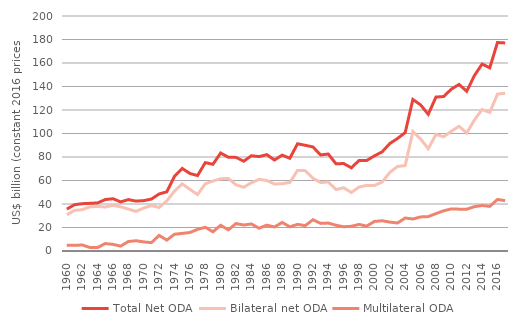
| Category | Total Net ODA | Bilateral net ODA | Multilateral ODA |
|---|---|---|---|
| 1960 | 35673.917 | 30791.372 | 4882.545 |
| 1961 | 39410.357 | 34618.006 | 4792.35 |
| 1962 | 40267.227 | 35146.929 | 5120.299 |
| 1963 | 40559.885 | 37550.515 | 3009.37 |
| 1964 | 40926.727 | 37965.61 | 2961.117 |
| 1965 | 43778.007 | 37449.271 | 6328.736 |
| 1966 | 44488.398 | 38849.524 | 5638.875 |
| 1967 | 41783.893 | 37628.273 | 4155.678 |
| 1968 | 43755.819 | 35680.089 | 8075.73 |
| 1969 | 42462.441 | 33740.754 | 8721.688 |
| 1970 | 42866.288 | 36571.936 | 7740.032 |
| 1971 | 44188.388 | 38621.987 | 7109.796 |
| 1972 | 48541.792 | 37047.775 | 13257.013 |
| 1973 | 50357.67 | 42672.479 | 9279.868 |
| 1974 | 63535.672 | 50991.825 | 14261.123 |
| 1975 | 70265.489 | 57117.757 | 14983.631 |
| 1976 | 65976.433 | 52459.68 | 15714.722 |
| 1977 | 64193.42 | 48081.423 | 18401.453 |
| 1978 | 75209.259 | 57138.432 | 20200.453 |
| 1979 | 73821.195 | 59572.068 | 16357.921 |
| 1980 | 83379.323 | 61488.033 | 21891.29 |
| 1981 | 79805.767 | 61796.802 | 18008.964 |
| 1982 | 79665.645 | 56327.777 | 23337.869 |
| 1983 | 76398.92 | 54267.648 | 22131.272 |
| 1984 | 81082.595 | 58083.064 | 22999.531 |
| 1985 | 80339.794 | 60969.911 | 19369.921 |
| 1986 | 82013.503 | 60022.734 | 21990.768 |
| 1987 | 77434.56 | 57001.652 | 20432.949 |
| 1988 | 81580.752 | 57276.179 | 24304.645 |
| 1989 | 78916.05 | 58329.948 | 20586.274 |
| 1990 | 91256.201 | 68594.554 | 22661.785 |
| 1991 | 89966.852 | 68395.816 | 21571.036 |
| 1992 | 88562.815 | 61945.616 | 26617.244 |
| 1993 | 81755.52 | 58246.897 | 23508.603 |
| 1994 | 82537.375 | 58760.197 | 23777.166 |
| 1995 | 74222.679 | 52301.912 | 21920.834 |
| 1996 | 74435.778 | 53807.392 | 20628.374 |
| 1997 | 70794.958 | 49763.025 | 21031.96 |
| 1998 | 77047.8 | 54422.57 | 22625.23 |
| 1999 | 77025.408 | 55840.531 | 21184.873 |
| 2000 | 80961.425 | 55779.906 | 25181.537 |
| 2001 | 84382.195 | 58669.262 | 25711.625 |
| 2002 | 91458.63 | 66846.139 | 24612.462 |
| 2003 | 95773.475 | 71939.592 | 23833.888 |
| 2004 | 100769.253 | 72709.366 | 28059.918 |
| 2005 | 128976.034 | 101731.237 | 27244.796 |
| 2006 | 124384.715 | 95380.433 | 29004.27 |
| 2007 | 116325.449 | 87051.384 | 29274.065 |
| 2008 | 131019.183 | 99192.783 | 31826.452 |
| 2009 | 131446.235 | 97248.352 | 34197.883 |
| 2010 | 137738.726 | 101907.74 | 35830.958 |
| 2011 | 141757.214 | 106149.323 | 35607.85 |
| 2012 | 135949.829 | 100430.982 | 35518.873 |
| 2013 | 149232.753 | 111511.091 | 37721.643 |
| 2014 | 159115.219 | 120377.832 | 38737.413 |
| 2015 | 155904.841 | 117927.604 | 37977.256 |
| 2016 | 177420.2 | 133536.27 | 43883.92 |
| 2017 | 177076.113 | 134231.608 | 42844.476 |